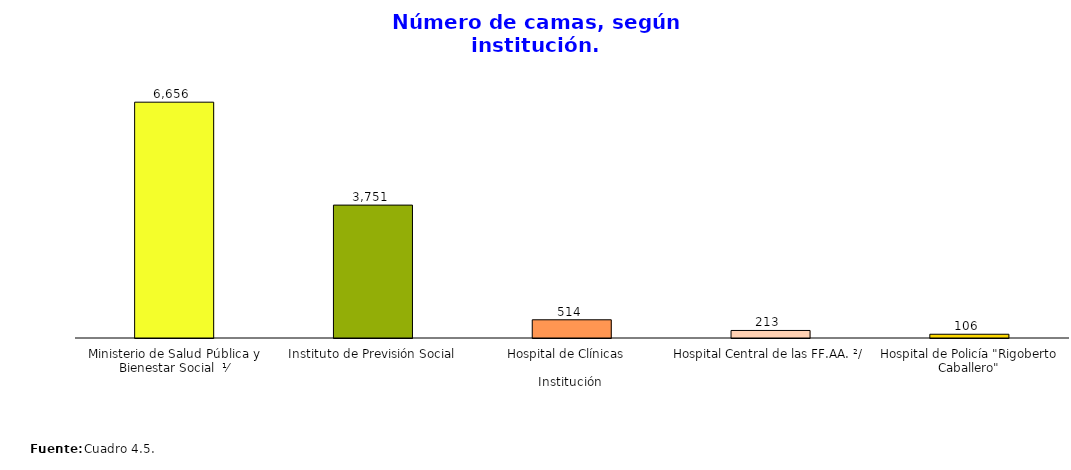
| Category | Series 0 |
|---|---|
| Ministerio de Salud Pública y Bienestar Social  ⅟ | 6656 |
| Instituto de Previsión Social | 3751 |
| Hospital de Clínicas   | 514 |
| Hospital Central de las FF.AA. ²/ | 213 |
| Hospital de Policía "Rigoberto Caballero" | 106 |